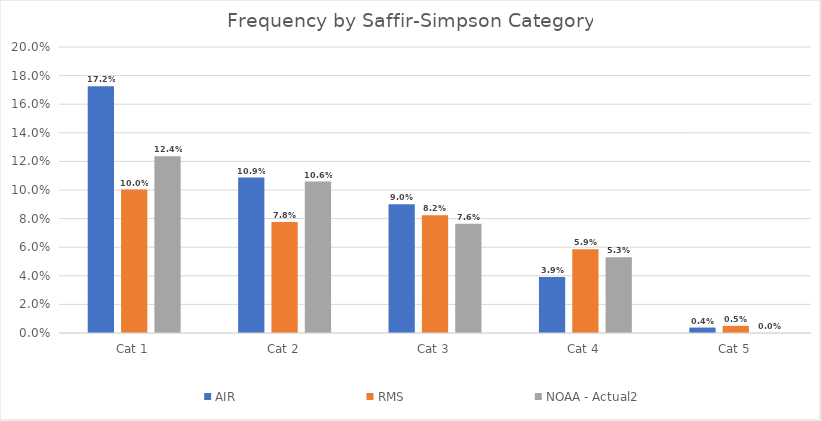
| Category | AIR | RMS | NOAA - Actual2 |
|---|---|---|---|
| Cat 1 | 0.172 | 0.1 | 0.124 |
| Cat 2 | 0.109 | 0.078 | 0.106 |
| Cat 3 | 0.09 | 0.082 | 0.076 |
| Cat 4 | 0.039 | 0.059 | 0.053 |
| Cat 5 | 0.004 | 0.005 | 0 |